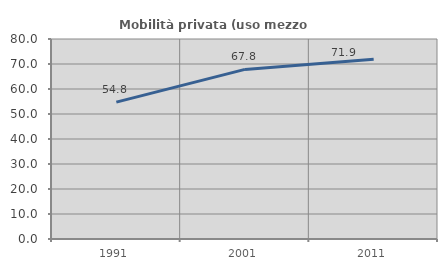
| Category | Mobilità privata (uso mezzo privato) |
|---|---|
| 1991.0 | 54.766 |
| 2001.0 | 67.845 |
| 2011.0 | 71.88 |